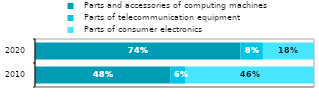
| Category |   Parts and accessories of computing machines |   Parts of telecommunication equipment |   Parts of consumer electronics |
|---|---|---|---|
| 2010 | 0.485 | 0.055 | 0.46 |
| 2020 | 0.736 | 0.081 | 0.183 |